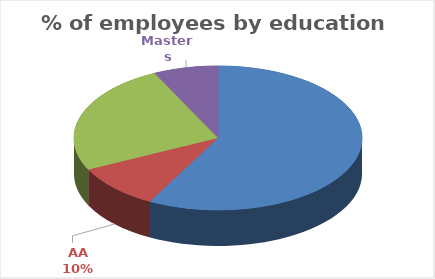
| Category | % |
|---|---|
| HS | 0.578 |
| AA | 0.099 |
| BA/BS | 0.25 |
| Masters | 0.073 |